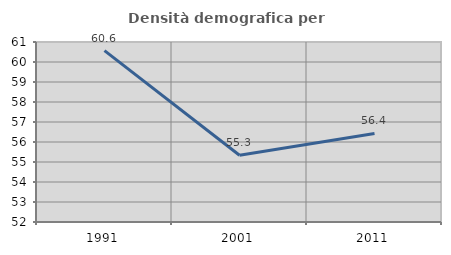
| Category | Densità demografica |
|---|---|
| 1991.0 | 60.566 |
| 2001.0 | 55.338 |
| 2011.0 | 56.427 |